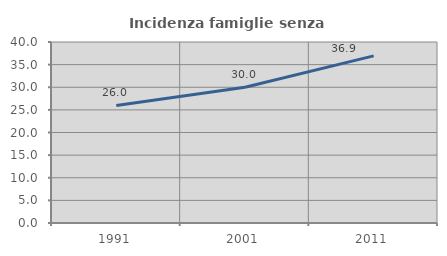
| Category | Incidenza famiglie senza nuclei |
|---|---|
| 1991.0 | 25.975 |
| 2001.0 | 30.01 |
| 2011.0 | 36.931 |